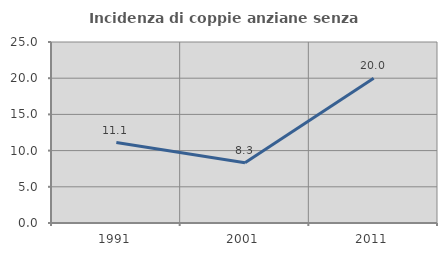
| Category | Incidenza di coppie anziane senza figli  |
|---|---|
| 1991.0 | 11.111 |
| 2001.0 | 8.333 |
| 2011.0 | 20 |